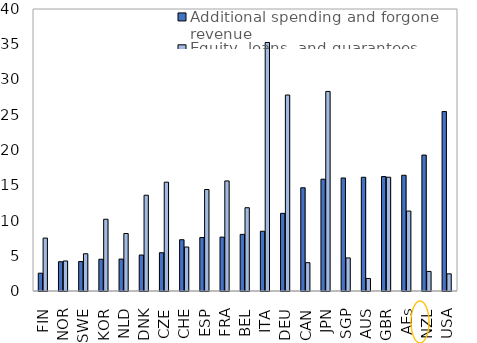
| Category | Additional spending and forgone revenue | Equity, loans, and guarantees |
|---|---|---|
| FIN | 2.526 | 7.506 |
| NOR | 4.151 | 4.26 |
| SWE | 4.181 | 5.285 |
| KOR | 4.505 | 10.18 |
| NLD | 4.53 | 8.156 |
| DNK | 5.103 | 13.584 |
| CZE | 5.432 | 15.435 |
| CHE | 7.272 | 6.238 |
| ESP | 7.589 | 14.397 |
| FRA | 7.641 | 15.611 |
| BEL | 8.03 | 11.811 |
| ITA | 8.477 | 35.254 |
| DEU | 11.014 | 27.798 |
| CAN | 14.641 | 4.02 |
| JPN | 15.861 | 28.308 |
| SGP | 16.031 | 4.69 |
| AUS | 16.131 | 1.778 |
| GBR | 16.232 | 16.138 |
| AEs | 16.417 | 11.341 |
| NZL | 19.284 | 2.779 |
| USA | 25.453 | 2.436 |